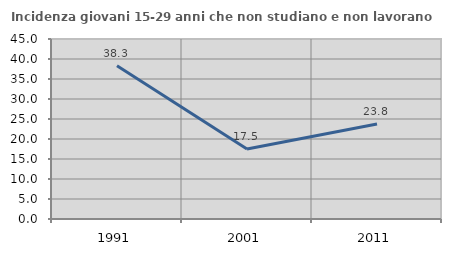
| Category | Incidenza giovani 15-29 anni che non studiano e non lavorano  |
|---|---|
| 1991.0 | 38.333 |
| 2001.0 | 17.481 |
| 2011.0 | 23.752 |